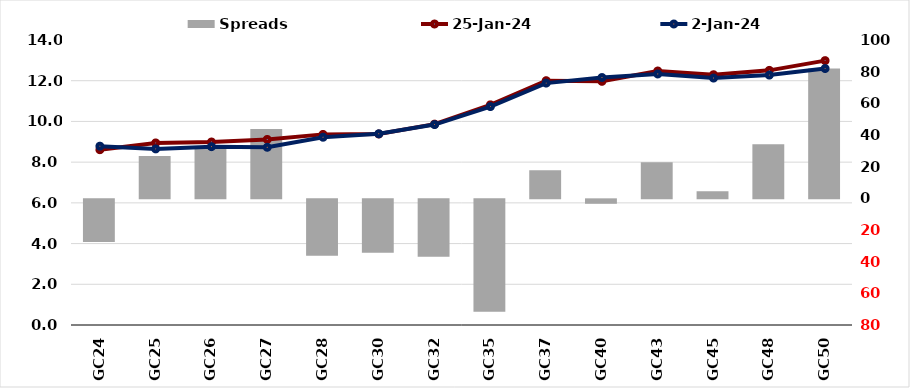
| Category |  Spreads   |
|---|---|
| GC24 | -27.006 |
| GC25 | 26.748 |
| GC26 | 31.298 |
| GC27 | 43.847 |
| GC28 | -35.633 |
| GC30 | -33.734 |
| GC32 | -36.211 |
| GC35 | -70.99 |
| GC37 | 17.773 |
| GC40 | -2.815 |
| GC43 | 22.787 |
| GC45 | 4.477 |
| GC48 | 34.079 |
| GC50 | 81.964 |